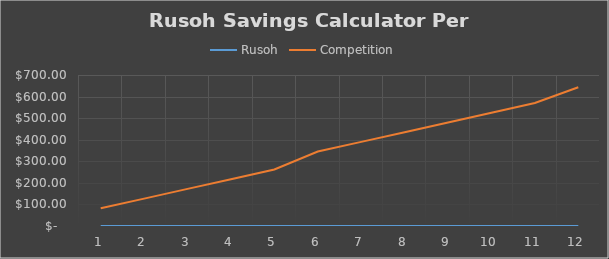
| Category | Rusoh | Competition |
|---|---|---|
| 1.0 | 0 | 82 |
| 2.0 | 0 | 127 |
| 3.0 | 0 | 172 |
| 4.0 | 0 | 217 |
| 5.0 | 0 | 262 |
| 6.0 | 0 | 345 |
| 7.0 | 0 | 390 |
| 8.0 | 0 | 435 |
| 9.0 | 0 | 480 |
| 10.0 | 0 | 525 |
| 11.0 | 0 | 570 |
| 12.0 | 0 | 643 |